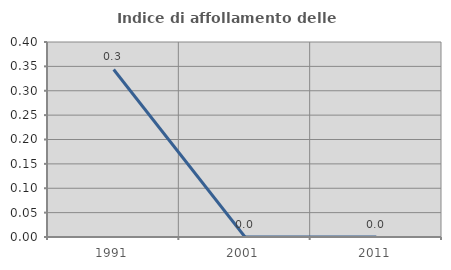
| Category | Indice di affollamento delle abitazioni  |
|---|---|
| 1991.0 | 0.344 |
| 2001.0 | 0 |
| 2011.0 | 0 |